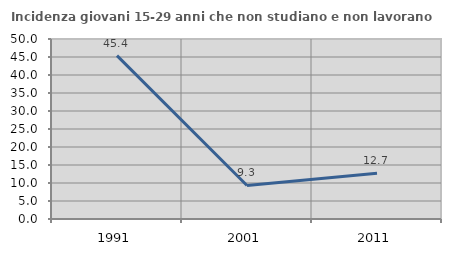
| Category | Incidenza giovani 15-29 anni che non studiano e non lavorano  |
|---|---|
| 1991.0 | 45.37 |
| 2001.0 | 9.317 |
| 2011.0 | 12.698 |